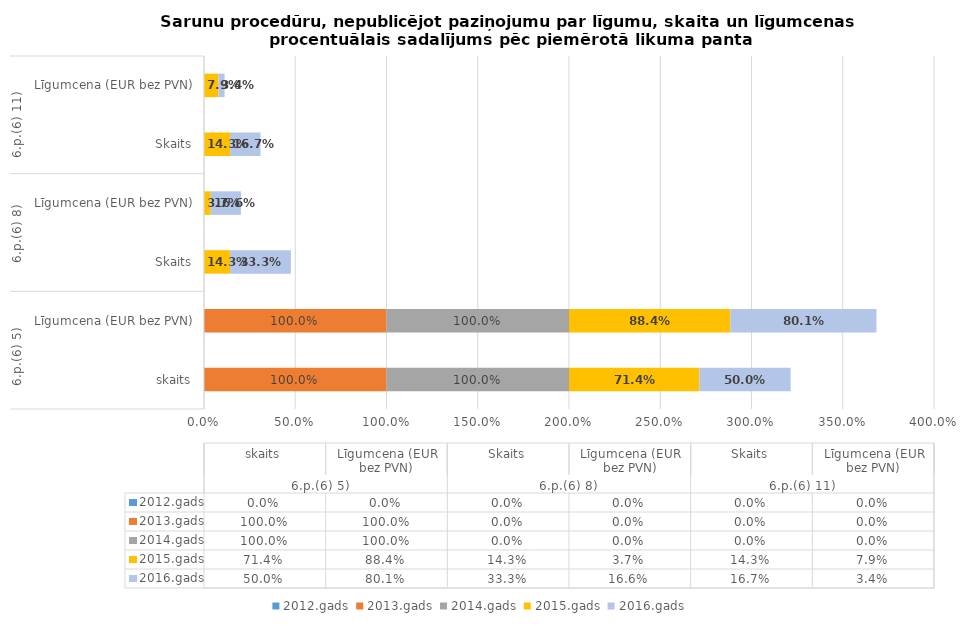
| Category | 2012.gads | 2013.gads | 2014.gads | 2015.gads | 2016.gads |
|---|---|---|---|---|---|
| 0 | 0 | 1 | 1 | 0.714 | 0.5 |
| 1 | 0 | 1 | 1 | 0.884 | 0.801 |
| 2 | 0 | 0 | 0 | 0.143 | 0.333 |
| 3 | 0 | 0 | 0 | 0.037 | 0.166 |
| 4 | 0 | 0 | 0 | 0.143 | 0.167 |
| 5 | 0 | 0 | 0 | 0.079 | 0.034 |